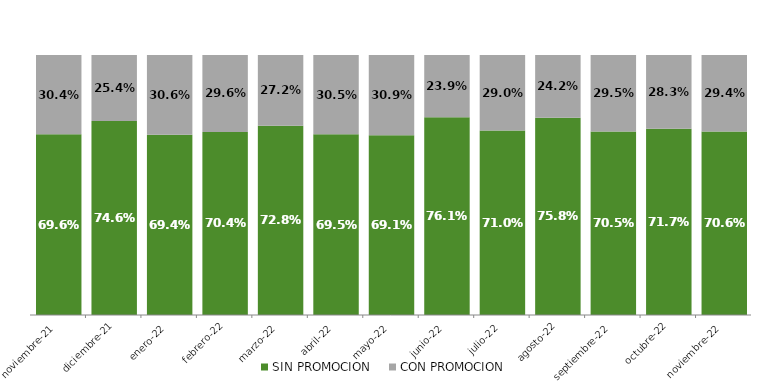
| Category | SIN PROMOCION   | CON PROMOCION   |
|---|---|---|
| 2021-11-01 | 0.696 | 0.304 |
| 2021-12-01 | 0.746 | 0.254 |
| 2022-01-01 | 0.694 | 0.306 |
| 2022-02-01 | 0.704 | 0.296 |
| 2022-03-01 | 0.728 | 0.272 |
| 2022-04-01 | 0.695 | 0.305 |
| 2022-05-01 | 0.691 | 0.309 |
| 2022-06-01 | 0.761 | 0.239 |
| 2022-07-01 | 0.71 | 0.29 |
| 2022-08-01 | 0.758 | 0.242 |
| 2022-09-01 | 0.705 | 0.295 |
| 2022-10-01 | 0.717 | 0.283 |
| 2022-11-01 | 0.706 | 0.294 |